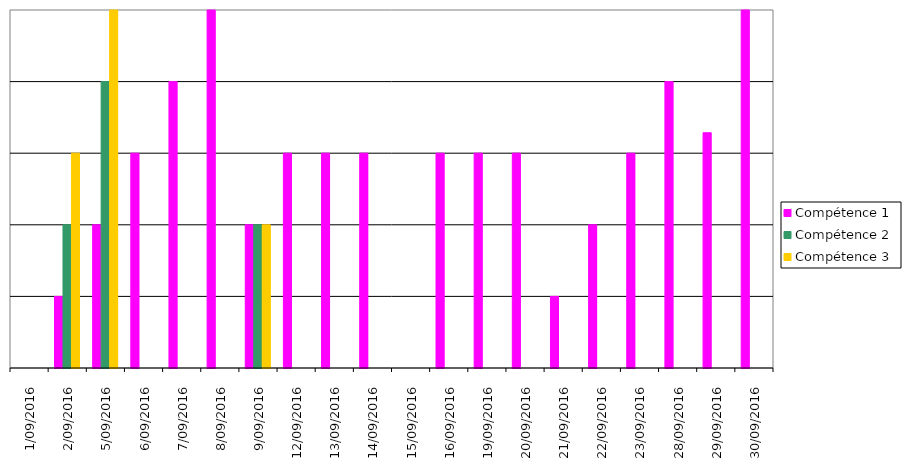
| Category | Compétence 1 | Compétence 2 | Compétence 3 |
|---|---|---|---|
| 1/09/2016 | 0 | 0 | 0 |
| 2/09/2016 | 1 | 2 | 3 |
| 5/09/2016 | 2 | 4 | 5 |
| 6/09/2016 | 3 | 0 | 0 |
| 7/09/2016 | 4 | 0 | 0 |
| 8/09/2016 | 5 | 0 | 0 |
| 9/09/2016 | 2 | 2 | 2 |
| 12/09/2016 | 3 | 0 | 0 |
| 13/09/2016 | 3 | 0 | 0 |
| 14/09/2016 | 3 | 0 | 0 |
| 15/09/2016 | 0 | 0 | 0 |
| 16/09/2016 | 3 | 0 | 0 |
| 19/09/2016 | 3 | 0 | 0 |
| 20/09/2016 | 3 | 0 | 0 |
| 21/09/2016 | 1 | 0 | 0 |
| 22/09/2016 | 2 | 0 | 0 |
| 23/09/2016 | 3 | 0 | 0 |
| 28/09/2016 | 4 | 0 | 0 |
| 29/09/2016 | 3.286 | 0 | 0 |
| 30/09/2016 | 5 | 0 | 0 |